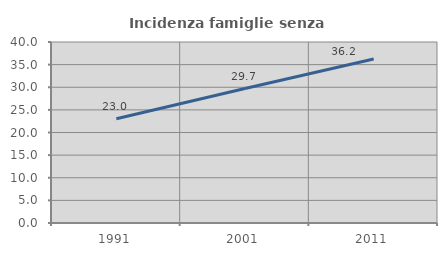
| Category | Incidenza famiglie senza nuclei |
|---|---|
| 1991.0 | 23.035 |
| 2001.0 | 29.712 |
| 2011.0 | 36.248 |